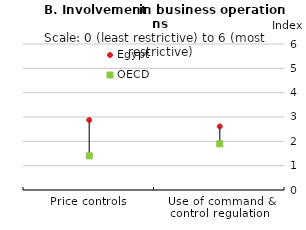
| Category | Egypt | OECD |
|---|---|---|
| Price controls | 2.875 | 1.404 |
| Use of command & control regulation  | 2.611 | 1.896 |